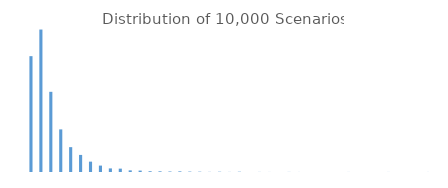
| Category | Series 0 |
|---|---|
| 0 | 2550 |
| 1 | 3136 |
| 2 | 1765 |
| 3 | 938 |
| 4 | 547 |
| 5 | 376 |
| 6 | 228 |
| 7 | 141 |
| 8 | 79 |
| 9 | 74 |
| 10 | 36 |
| 11 | 31 |
| 12 | 17 |
| 13 | 15 |
| 14 | 11 |
| 15 | 14 |
| 16 | 9 |
| 17 | 7 |
| 18 | 3 |
| 19 | 6 |
| 20 | 2 |
| 21 | 6 |
| 22 | 0 |
| 23 | 2 |
| 24 | 1 |
| 25 | 0 |
| 26 | 2 |
| 27 | 1 |
| 28 | 0 |
| 29 | 0 |
| 30 | 0 |
| 31 | 0 |
| 32 | 1 |
| 33 | 0 |
| 34 | 0 |
| 35 | 0 |
| 36 | 1 |
| 37 | 0 |
| 38 | 0 |
| 39 | 0 |
| 40 | 1 |